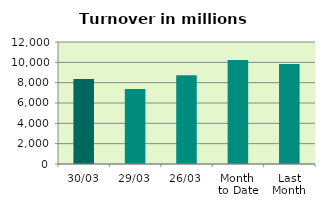
| Category | Series 0 |
|---|---|
| 30/03 | 8356.758 |
| 29/03 | 7381.773 |
| 26/03 | 8725.585 |
| Month 
to Date | 10230.458 |
| Last
Month | 9824.278 |